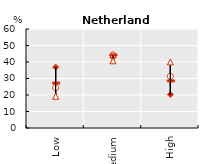
| Category | Series 0 | Series 1 | Series 2 | Series 3 |
|---|---|---|---|---|
| Low | 36.871 | 24.425 | 27.202 | 19.21 |
| Medium | 42.862 | 44.242 | 44.264 | 40.732 |
| High | 20.267 | 31.333 | 28.534 | 40.057 |